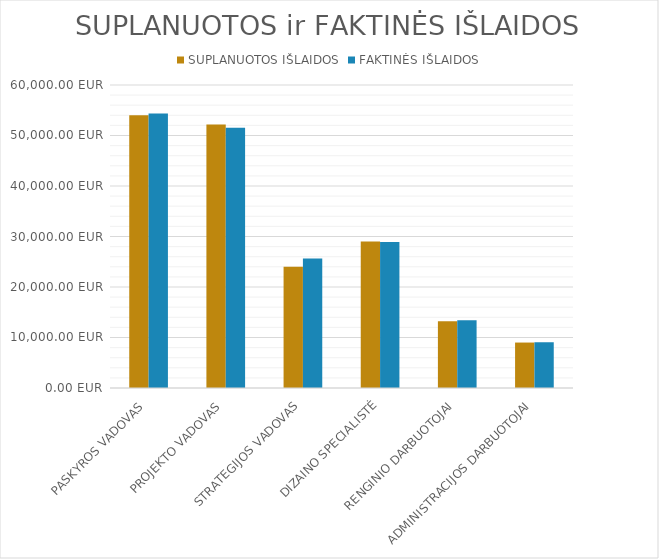
| Category | SUPLANUOTOS IŠLAIDOS | FAKTINĖS IŠLAIDOS |
|---|---|---|
| PASKYROS VADOVAS | 54000 | 54360 |
| PROJEKTO VADOVAS | 52200 | 51540 |
| STRATEGIJOS VADOVAS | 24000 | 25650 |
| DIZAINO SPECIALISTĖ | 29000 | 28900 |
| RENGINIO DARBUOTOJAI | 13200 | 13400 |
| ADMINISTRACIJOS DARBUOTOJAI | 9000 | 9060 |